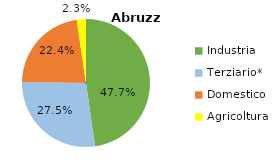
| Category | Abruzzo |
|---|---|
| Industria | 0.477 |
| Terziario* | 0.275 |
| Domestico | 0.224 |
| Agricoltura | 0.023 |